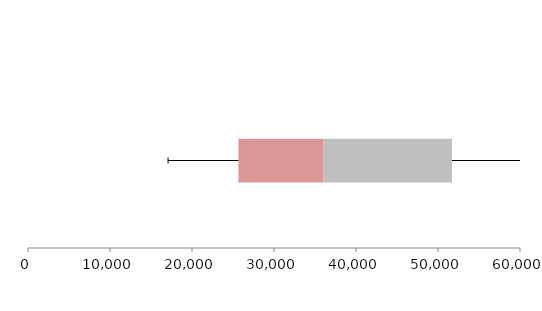
| Category | Series 1 | Series 2 | Series 3 |
|---|---|---|---|
| 0 | 25659.862 | 10389.38 | 15652.622 |